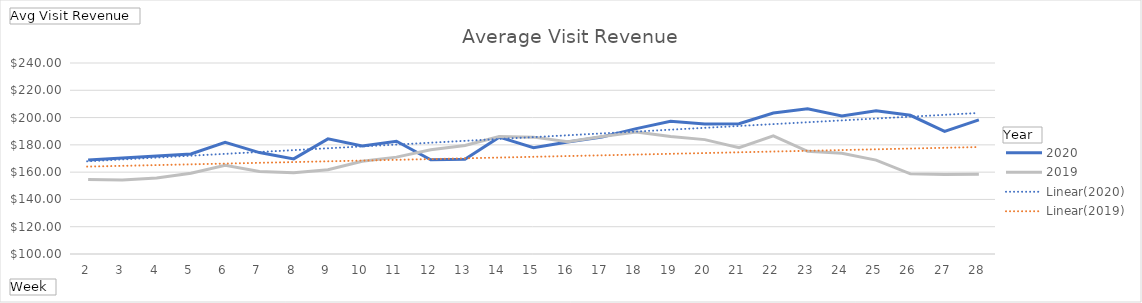
| Category | 2020 | 2019 |
|---|---|---|
| 2 | 168.811 | 154.609 |
| 3 | 170.318 | 154.332 |
| 4 | 171.832 | 155.645 |
| 5 | 173.321 | 159.187 |
| 6 | 181.796 | 164.951 |
| 7 | 174.348 | 160.458 |
| 8 | 169.718 | 159.544 |
| 9 | 184.391 | 161.75 |
| 10 | 179.228 | 167.985 |
| 11 | 182.69 | 170.998 |
| 12 | 169.049 | 176.372 |
| 13 | 169.395 | 179.514 |
| 14 | 185.661 | 186.073 |
| 15 | 177.857 | 185.659 |
| 16 | 182.116 | 182.361 |
| 17 | 185.798 | 186.119 |
| 18 | 191.895 | 189.366 |
| 19 | 197.297 | 186.068 |
| 20 | 195.233 | 183.844 |
| 21 | 195.501 | 177.89 |
| 22 | 203.288 | 186.655 |
| 23 | 206.386 | 175.318 |
| 24 | 201.249 | 173.771 |
| 25 | 204.948 | 168.83 |
| 26 | 201.666 | 158.728 |
| 27 | 189.833 | 158.36 |
| 28 | 198.348 | 158.531 |